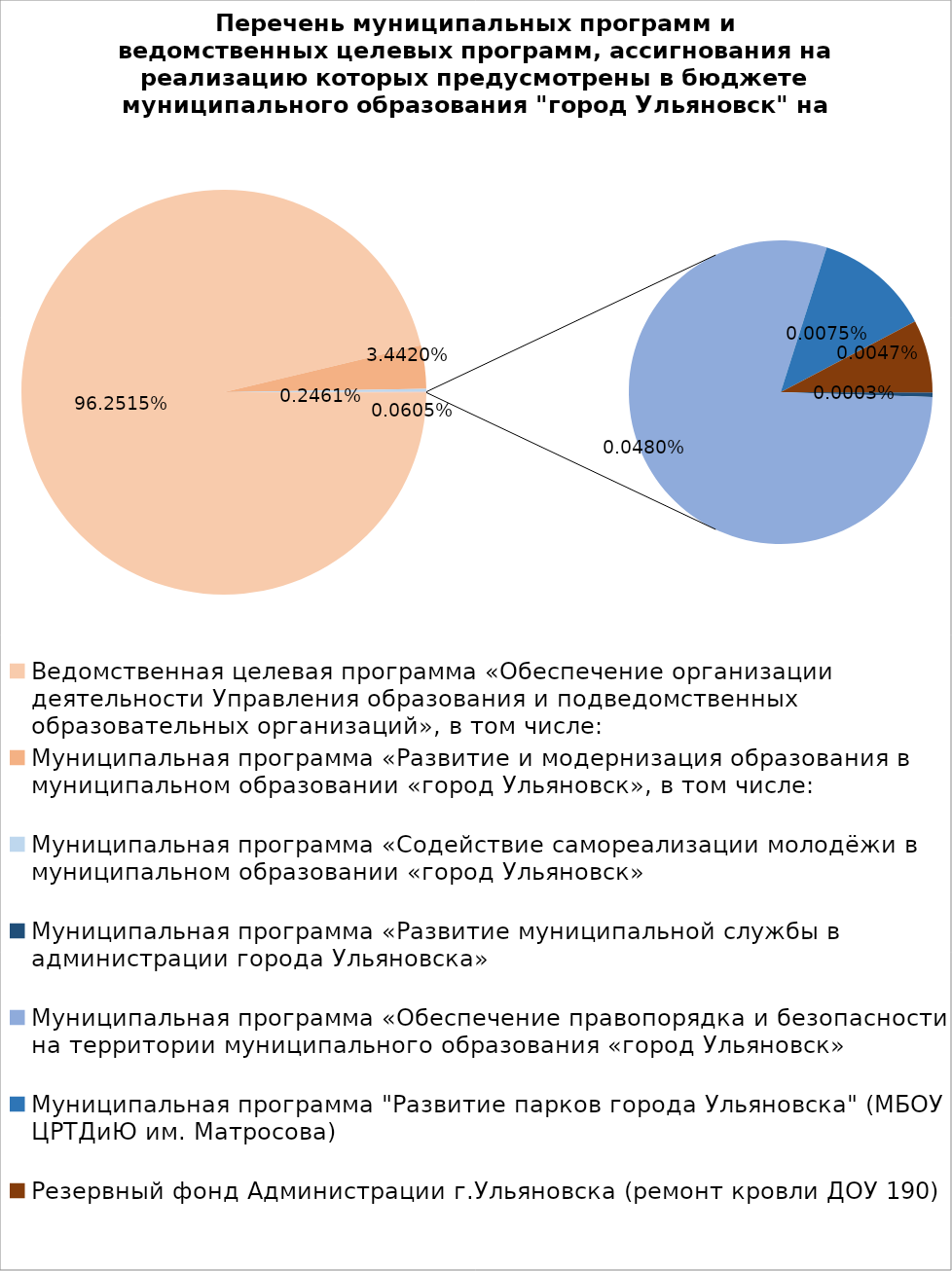
| Category | Series 0 |
|---|---|
| Ведомственная целевая программа «Обеспечение организации деятельности Управления образования и подведомственных образовательных организаций», в том числе: | 5142476.56 |
| Муниципальная программа «Развитие и модернизация образования в муниципальном образовании «город Ульяновск», в том числе: | 183896.7 |
| Муниципальная программа «Содействие самореализации молодёжи в муниципальном образовании «город Ульяновск» | 13148.32 |
| Муниципальная программа «Развитие муниципальной службы в администрации города Ульяновска» | 15.4 |
| Муниципальная программа «Обеспечение правопорядка и безопасности на территории муниципального образования «город Ульяновск» | 2565 |
| Муниципальная программа "Развитие парков города Ульяновска" (МБОУ ЦРТДиЮ им. Матросова) | 400 |
| Резервный фонд Администрации г.Ульяновска (ремонт кровли ДОУ 190) | 250 |